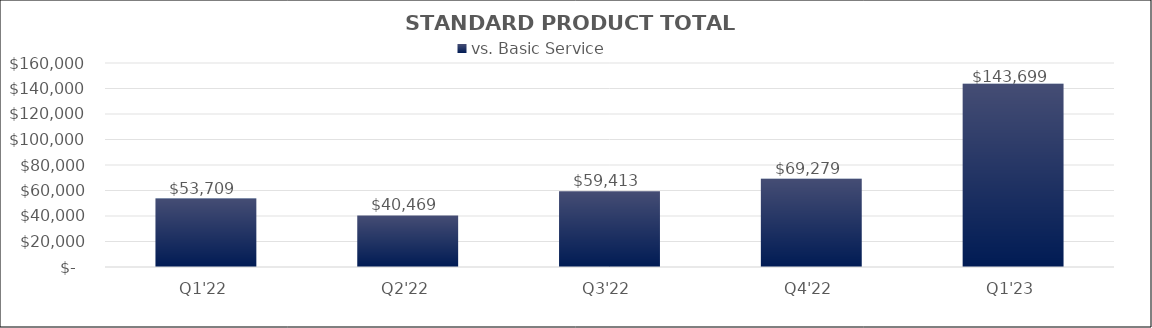
| Category | vs. Basic Service |
|---|---|
| Q1'22 | 53708.915 |
| Q2'22 | 40469.084 |
| Q3'22 | 59413.17 |
| Q4'22 | 69278.733 |
| Q1'23 | 143698.578 |